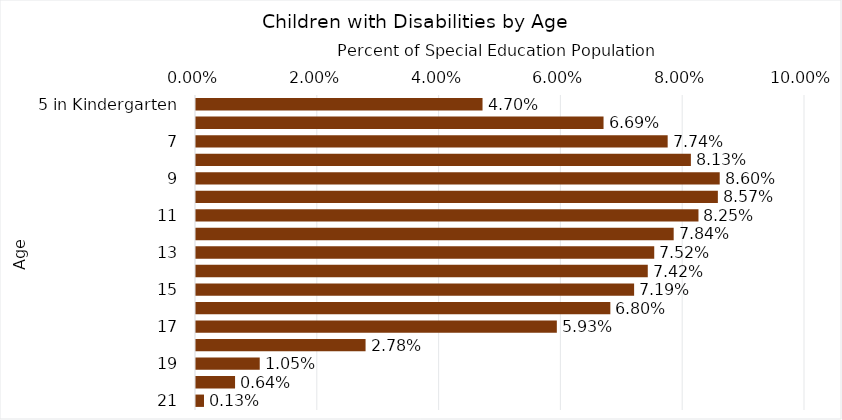
| Category | Percentage |
|---|---|
| 5 in Kindergarten | 0.047 |
| 6 | 0.067 |
| 7 | 0.077 |
| 8 | 0.081 |
| 9 | 0.086 |
| 10 | 0.086 |
| 11 | 0.083 |
| 12 | 0.078 |
| 13 | 0.075 |
| 14 | 0.074 |
| 15 | 0.072 |
| 16 | 0.068 |
| 17 | 0.059 |
| 18 | 0.028 |
| 19 | 0.01 |
| 20 | 0.006 |
| 21 | 0.001 |